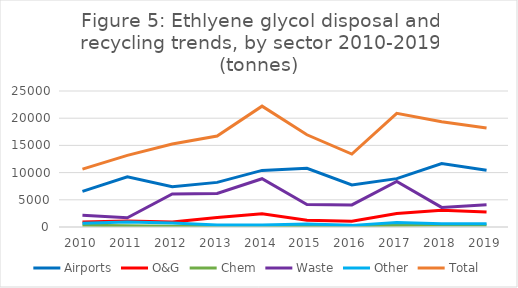
| Category | Airports | O&G | Chem | Waste | Other | Total |
|---|---|---|---|---|---|---|
| 2010.0 | 6556.238 | 919.849 | 302.821 | 2180.765 | 681.843 | 10641.516 |
| 2011.0 | 9211.399 | 1100.927 | 245.741 | 1698.064 | 914.847 | 13170.977 |
| 2012.0 | 7409.109 | 932.151 | 142.349 | 6061.822 | 715.861 | 15261.292 |
| 2013.0 | 8203.413 | 1729.749 | 251.326 | 6164.561 | 385.289 | 16734.339 |
| 2014.0 | 10404.209 | 2423.471 | 154.614 | 8870.51 | 362.522 | 22215.326 |
| 2015.0 | 10803.566 | 1224.559 | 242.982 | 4140.246 | 541.717 | 16953.07 |
| 2016.0 | 7734.227 | 1040.017 | 262.175 | 4067.072 | 299.025 | 13402.517 |
| 2017.0 | 8890.602 | 2488.321 | 300.404 | 8373.433 | 834.083 | 20886.843 |
| 2018.0 | 11679.496 | 3093.302 | 379.128 | 3601.959 | 604.397 | 19358.28 |
| 2019.0 | 10428.842 | 2737.493 | 367.573 | 4067.856 | 605.215 | 18206.98 |